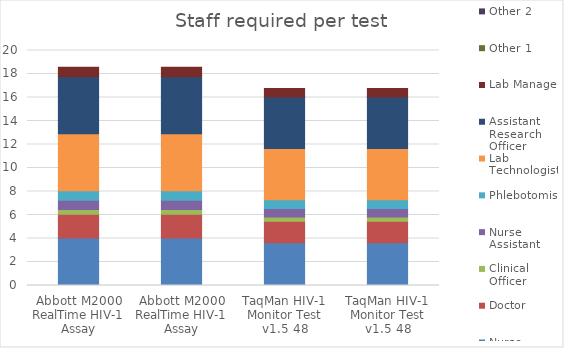
| Category | Nurse   | Doctor | Clinical Officer | Nurse Assistant  | Phlebotomist | Lab Technologist | Assistant Research Officer | Lab Manager | Other 1 | Other 2 |
|---|---|---|---|---|---|---|---|---|---|---|
| Abbott M2000 RealTime HIV-1 Assay | 4.036 | 2.018 | 0.404 | 0.807 | 0.807 | 4.844 | 4.844 | 0.807 |  |  |
| Abbott M2000 RealTime HIV-1 Assay | 4.036 | 2.018 | 0.404 | 0.807 | 0.807 | 4.844 | 4.844 | 0.807 |  |  |
| TaqMan HIV-1 Monitor Test v1.5 48 | 3.646 | 1.823 | 0.365 | 0.729 | 0.729 | 4.375 | 4.375 | 0.729 |  |  |
| TaqMan HIV-1 Monitor Test v1.5 48 | 3.646 | 1.823 | 0.365 | 0.729 | 0.729 | 4.375 | 4.375 | 0.729 |  |  |